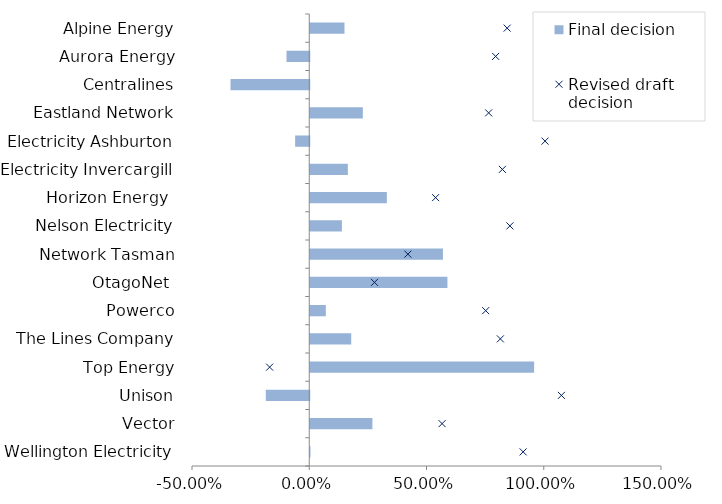
| Category | Final decision |
|---|---|
| Alpine Energy | 0.146 |
| Aurora Energy | -0.097 |
| Centralines | -0.336 |
| Eastland Network | 0.224 |
| Electricity Ashburton | -0.06 |
| Electricity Invercargill | 0.16 |
| Horizon Energy  | 0.327 |
| Nelson Electricity | 0.135 |
| Network Tasman | 0.566 |
| OtagoNet  | 0.585 |
| Powerco | 0.066 |
| The Lines Company | 0.175 |
| Top Energy | 0.955 |
| Unison | -0.185 |
| Vector | 0.265 |
| Wellington Electricity | 0.001 |